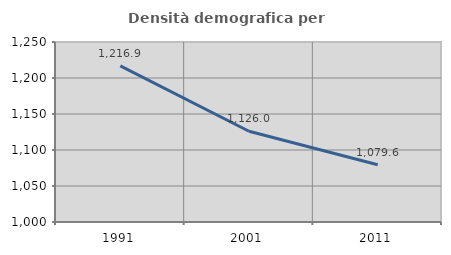
| Category | Densità demografica |
|---|---|
| 1991.0 | 1216.892 |
| 2001.0 | 1126.007 |
| 2011.0 | 1079.616 |